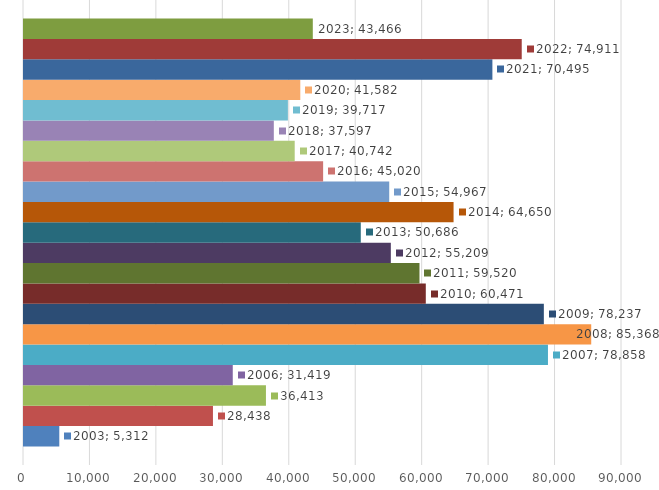
| Category | 2003 | 2004 | 2005 | 2006 | 2007 | 2008 | 2009 | 2010 | 2011 | 2012 | 2013 | 2014 | 2015 | 2016 | 2017 | 2018 | 2019 | 2020 | 2021 | 2022 | 2023 |
|---|---|---|---|---|---|---|---|---|---|---|---|---|---|---|---|---|---|---|---|---|---|
| 0 | 5312 | 28438 | 36413 | 31419 | 78858 | 85368 | 78237 | 60471 | 59520 | 55209 | 50686 | 64650 | 54967 | 45020 | 40742 | 37597 | 39717 | 41582 | 70495 | 74911 | 43466 |